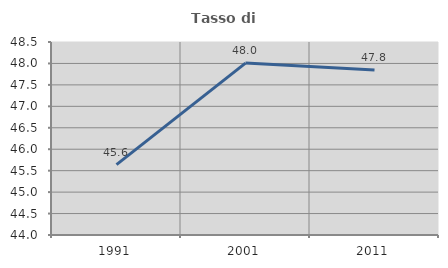
| Category | Tasso di occupazione   |
|---|---|
| 1991.0 | 45.641 |
| 2001.0 | 48.008 |
| 2011.0 | 47.845 |